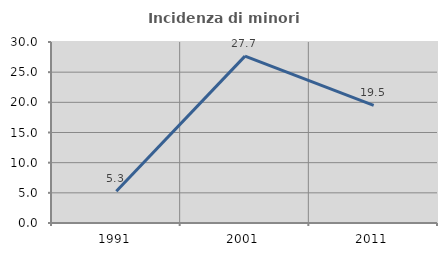
| Category | Incidenza di minori stranieri |
|---|---|
| 1991.0 | 5.263 |
| 2001.0 | 27.66 |
| 2011.0 | 19.512 |